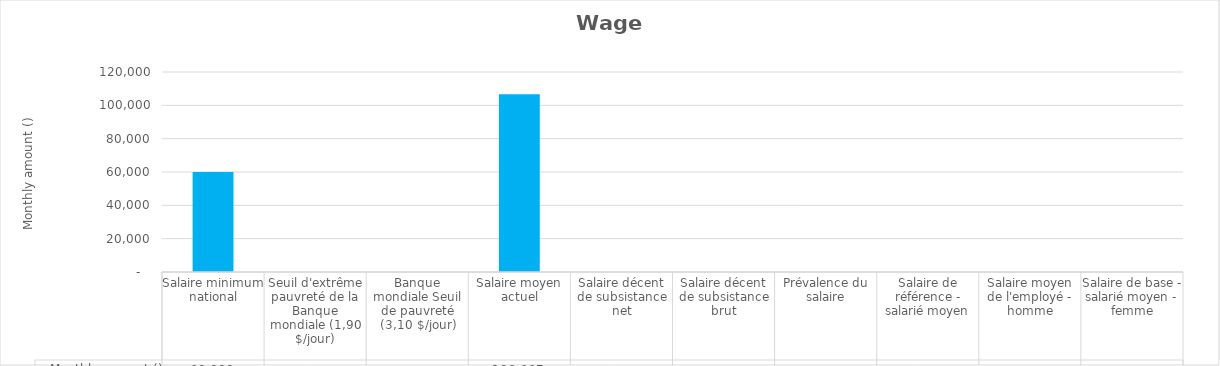
| Category |  Monthly amount ()  |
|---|---|
| Salaire minimum national | 60000 |
| Seuil d'extrême pauvreté de la Banque mondiale (1,90 $/jour) | 0 |
| Banque mondiale Seuil de pauvreté (3,10 $/jour) | 0 |
| Salaire moyen actuel | 106667 |
| Salaire décent de subsistance net | 0 |
| Salaire décent de subsistance brut | 0 |
| Prévalence du salaire | 0 |
| Salaire de référence - salarié moyen | 0 |
| Salaire moyen de l'employé - homme | 0 |
| Salaire de base - salarié moyen - femme | 0 |